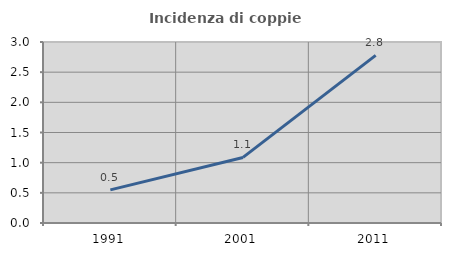
| Category | Incidenza di coppie miste |
|---|---|
| 1991.0 | 0.549 |
| 2001.0 | 1.087 |
| 2011.0 | 2.778 |